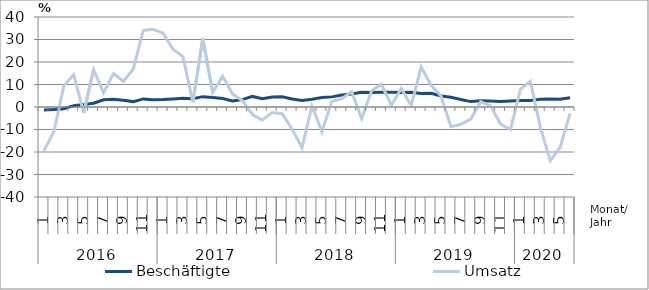
| Category | Beschäftigte | Umsatz |
|---|---|---|
| 0 | -1.3 | -19.4 |
| 1 | -1.1 | -11 |
| 2 | -0.8 | 9.4 |
| 3 | 0.6 | 14.4 |
| 4 | 1.1 | -2.6 |
| 5 | 1.7 | 16.5 |
| 6 | 3.2 | 6.3 |
| 7 | 3.4 | 14.9 |
| 8 | 3 | 11.4 |
| 9 | 2.4 | 16.9 |
| 10 | 3.6 | 34 |
| 11 | 3.2 | 34.5 |
| 12 | 3.3 | 32.8 |
| 13 | 3.6 | 25.7 |
| 14 | 3.9 | 22.4 |
| 15 | 3.7 | 2.1 |
| 16 | 4.6 | 30.4 |
| 17 | 4.2 | 6.4 |
| 18 | 3.8 | 13.7 |
| 19 | 2.7 | 5.8 |
| 20 | 3.3 | 2.8 |
| 21 | 4.7 | -3.4 |
| 22 | 3.7 | -5.8 |
| 23 | 4.4 | -2.5 |
| 24 | 4.5 | -3 |
| 25 | 3.6 | -9.8 |
| 26 | 2.9 | -18.1 |
| 27 | 3.4 | 0.5 |
| 28 | 4.2 | -11 |
| 29 | 4.5 | 2.5 |
| 30 | 5.3 | 3.7 |
| 31 | 5.8 | 6.8 |
| 32 | 6.6 | -5.2 |
| 33 | 6.5 | 7.1 |
| 34 | 6.6 | 10.1 |
| 35 | 6.6 | 0.8 |
| 36 | 6.4 | 8.2 |
| 37 | 6.5 | 0.6 |
| 38 | 6 | 17.8 |
| 39 | 6.1 | 9.6 |
| 40 | 4.9 | 4.9 |
| 41 | 4.3 | -8.8 |
| 42 | 3.3 | -7.7 |
| 43 | 2.4 | -5.4 |
| 44 | 2.8 | 2.4 |
| 45 | 2.7 | 0.5 |
| 46 | 2.5 | -7.6 |
| 47 | 2.7 | -10 |
| 48 | 2.9 | 7.8 |
| 49 | 2.9 | 11.5 |
| 50 | 3.4 | -8.8 |
| 51 | 3.6 | -23.9 |
| 52 | 3.4 | -18 |
| 53 | 4.1 | -2.8 |